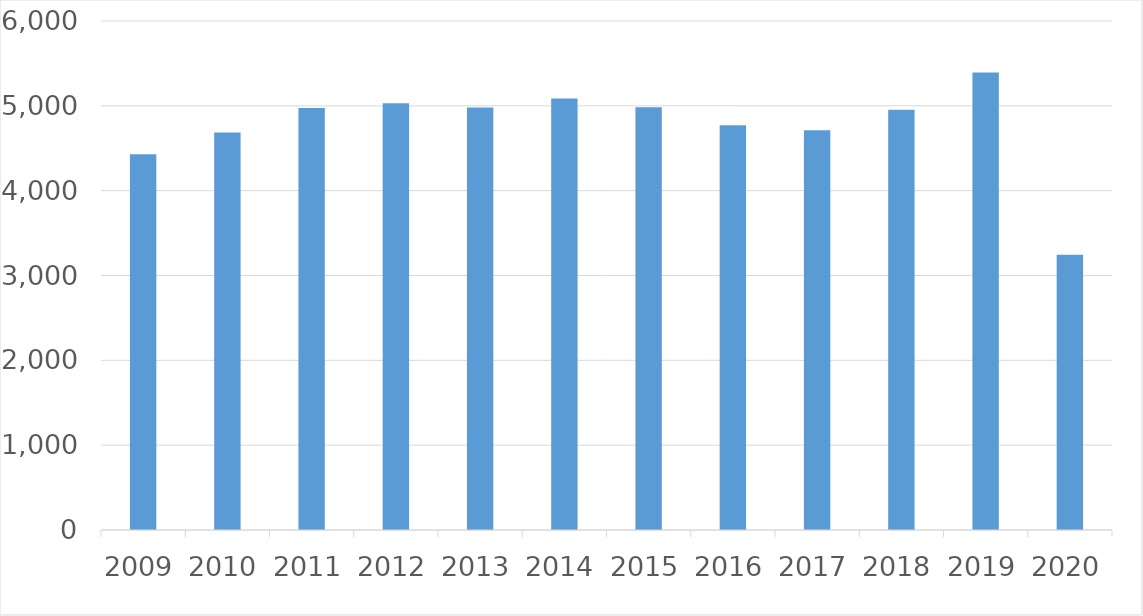
| Category | Series 0 |
|---|---|
| 2009 | 4428 |
| 2010 | 4686 |
| 2011 | 4974 |
| 2012 | 5029 |
| 2013 | 4979 |
| 2014 | 5086 |
| 2015 | 4983 |
| 2016 | 4771 |
| 2017 | 4712 |
| 2018 | 4954 |
| 2019 | 5394 |
| 2020 | 3244 |